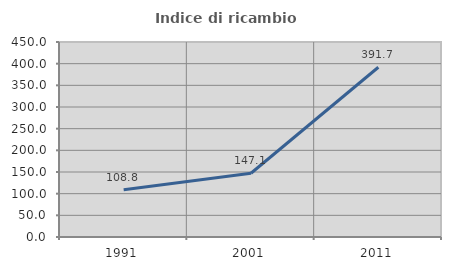
| Category | Indice di ricambio occupazionale  |
|---|---|
| 1991.0 | 108.791 |
| 2001.0 | 147.059 |
| 2011.0 | 391.667 |